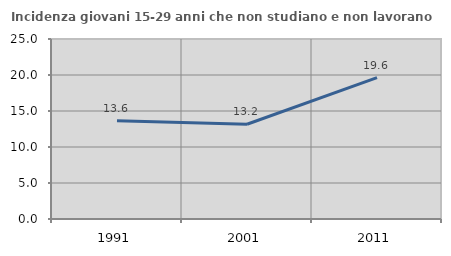
| Category | Incidenza giovani 15-29 anni che non studiano e non lavorano  |
|---|---|
| 1991.0 | 13.633 |
| 2001.0 | 13.158 |
| 2011.0 | 19.634 |